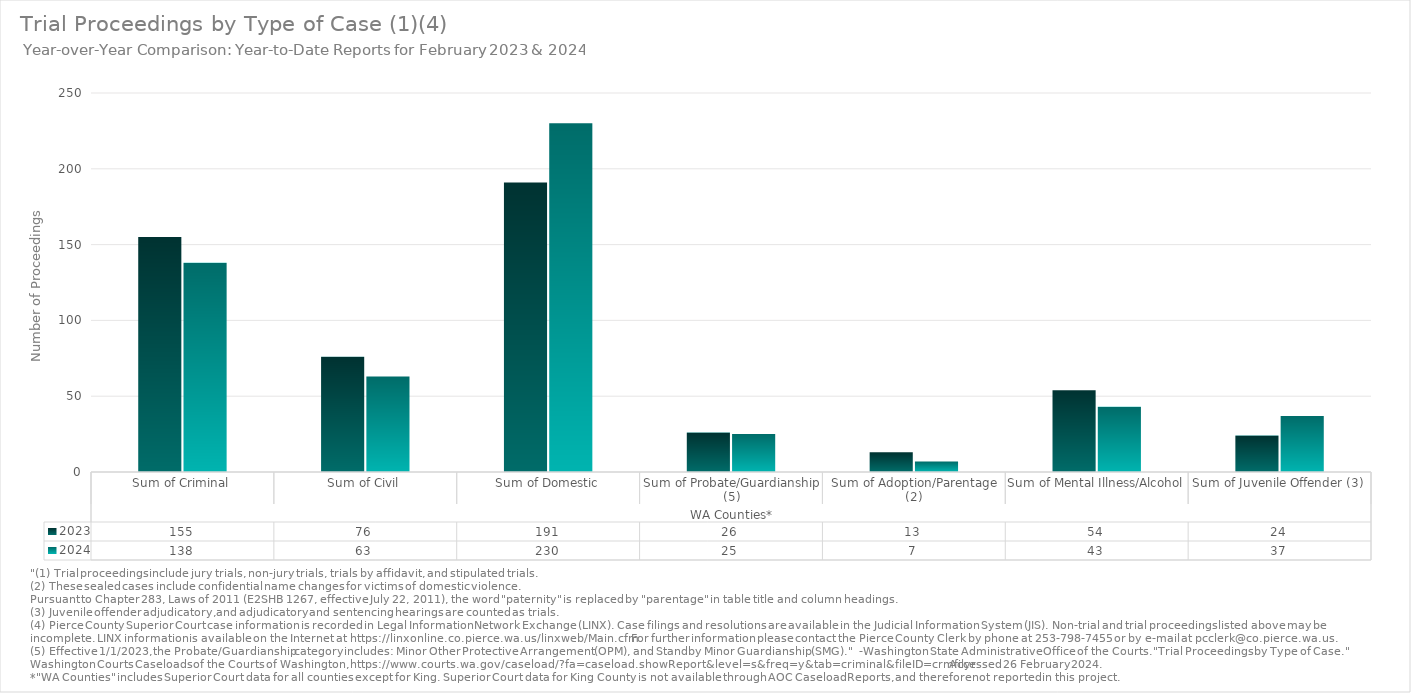
| Category | 2023 | 2024 |
|---|---|---|
| 0 | 155 | 138 |
| 1 | 76 | 63 |
| 2 | 191 | 230 |
| 3 | 26 | 25 |
| 4 | 13 | 7 |
| 5 | 54 | 43 |
| 6 | 24 | 37 |